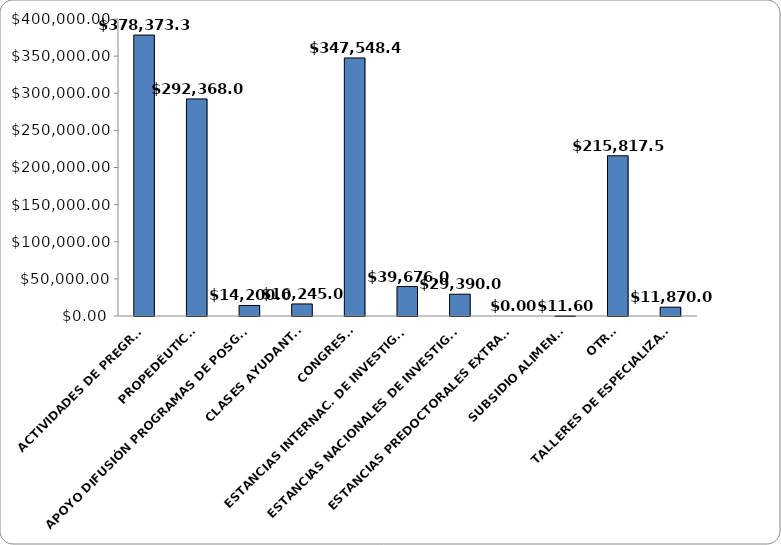
| Category | Series 0 |
|---|---|
| ACTIVIDADES DE PREGRADO | 378373.378 |
| PROPEDÉUTICOS | 292368.012 |
| APOYO DIFUSIÓN PROGRAMAS DE POSGRADO | 14200 |
| CLASES AYUDANTÍAS | 16245 |
| CONGRESOS | 347548.43 |
| ESTANCIAS INTERNAC. DE INVESTIGACIÓN | 39676.05 |
| ESTANCIAS NACIONALES DE INVESTIGACIÓN | 29390 |
| ESTANCIAS PREDOCTORALES EXTRANJERO | 0 |
| SUBSIDIO ALIMENTOS | 11.6 |
| OTROS | 215817.533 |
| TALLERES DE ESPECIALIZACIÓN | 11870 |